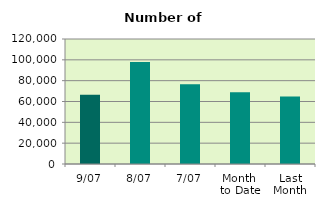
| Category | Series 0 |
|---|---|
| 9/07 | 66454 |
| 8/07 | 97872 |
| 7/07 | 76626 |
| Month 
to Date | 68775.714 |
| Last
Month | 64737.364 |